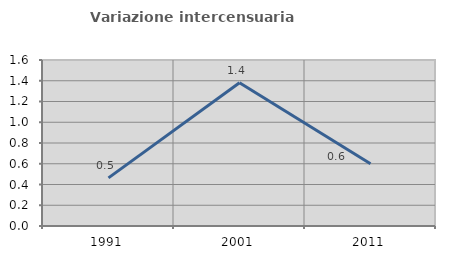
| Category | Variazione intercensuaria annua |
|---|---|
| 1991.0 | 0.464 |
| 2001.0 | 1.38 |
| 2011.0 | 0.599 |